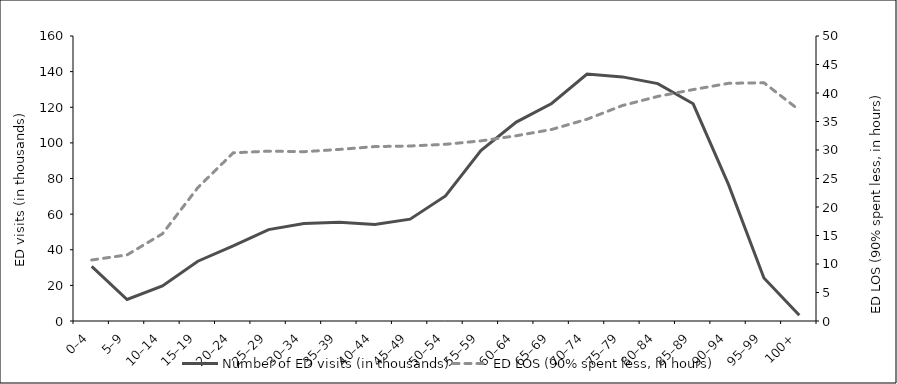
| Category | Number of ED visits (in thousands) |
|---|---|
| 0–4 | 30.628 |
| 5–9 | 12.076 |
| 10–14 | 19.713 |
| 15–19 | 33.572 |
| 20–24 | 42.141 |
| 25–29 | 51.305 |
| 30–34 | 54.722 |
| 35–39 | 55.432 |
| 40–44 | 54.215 |
| 45–49 | 57.184 |
| 50–54 | 70.192 |
| 55–59 | 95.635 |
| 60–64 | 111.676 |
| 65–69 | 122.117 |
| 70–74 | 138.679 |
| 75–79 | 137.045 |
| 80–84 | 133.269 |
| 85–89 | 121.927 |
| 90–94 | 76.525 |
| 95–99 | 24.179 |
| 100+ | 3.223 |